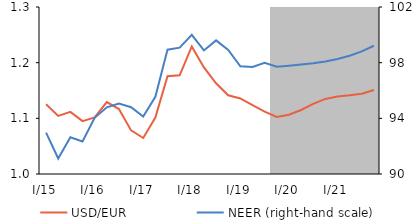
| Category | USD/EUR |
|---|---|
| I/15 | 1.125 |
| II | 1.104 |
| III | 1.112 |
| IV | 1.095 |
| I/16 | 1.102 |
| II | 1.129 |
| III | 1.117 |
| IV | 1.078 |
| I/17 | 1.065 |
| II | 1.102 |
| III | 1.176 |
| IV | 1.177 |
| I/18 | 1.229 |
| II | 1.191 |
| III | 1.163 |
| IV | 1.141 |
| I/19 | 1.136 |
| II | 1.124 |
| III | 1.112 |
| IV | 1.103 |
| I/20 | 1.106 |
| II | 1.115 |
| III | 1.126 |
| IV | 1.135 |
| I/21 | 1.139 |
| II | 1.141 |
| III | 1.144 |
| IV | 1.151 |